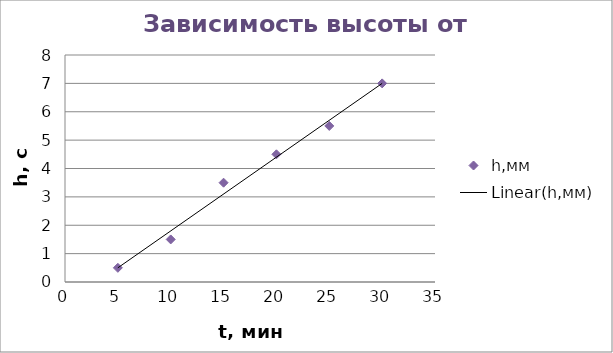
| Category | h,мм |
|---|---|
| 5.0 | 0.5 |
| 10.0 | 1.5 |
| 15.0 | 3.5 |
| 20.0 | 4.5 |
| 25.0 | 5.5 |
| 30.0 | 7 |